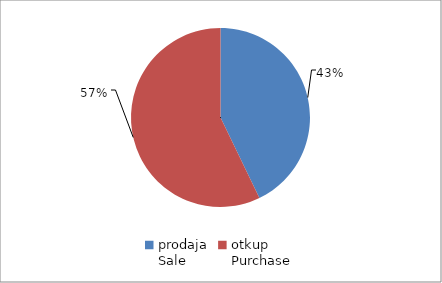
| Category | Series 0 |
|---|---|
| prodaja
Sale | 10661108 |
| otkup
Purchase | 14225120 |